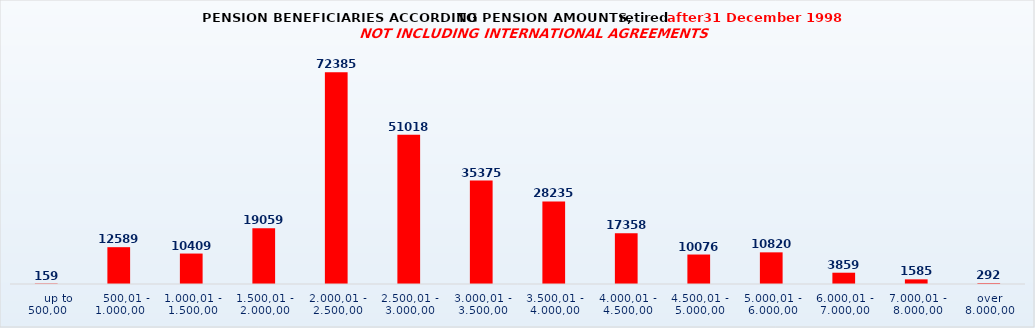
| Category | Series 0 |
|---|---|
|      up to 500,00 | 159 |
|    500,01 - 1.000,00 | 12589 |
| 1.000,01 - 1.500,00 | 10409 |
| 1.500,01 - 2.000,00 | 19059 |
| 2.000,01 - 2.500,00 | 72385 |
| 2.500,01 - 3.000,00 | 51018 |
| 3.000,01 - 3.500,00 | 35375 |
| 3.500,01 - 4.000,00 | 28235 |
| 4.000,01 - 4.500,00 | 17358 |
| 4.500,01 - 5.000,00 | 10076 |
| 5.000,01 - 6.000,00 | 10820 |
| 6.000,01 - 7.000,00 | 3859 |
| 7.000,01 - 8.000,00 | 1585 |
| over 8.000,00 | 292 |